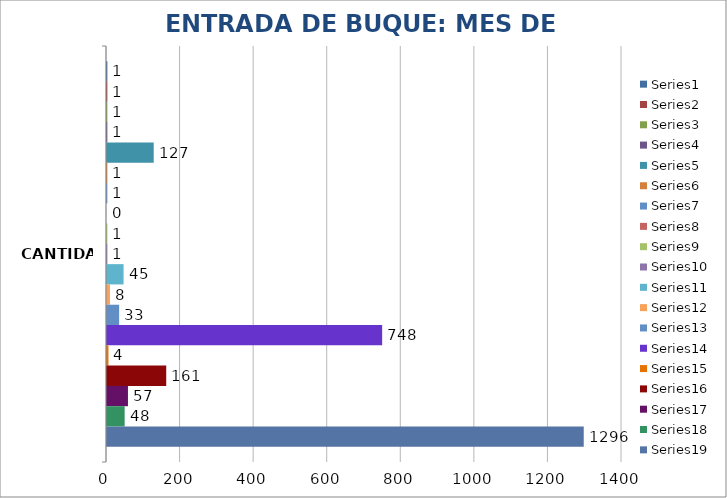
| Category | Series 0 | Series 1 | Series 2 | Series 3 | Series 4 | Series 5 | Series 6 | Series 7 | Series 8 | Series 9 | Series 10 | Series 11 | Series 12 | Series 13 | Series 14 | Series 15 | Series 16 | Series 17 | Series 18 |
|---|---|---|---|---|---|---|---|---|---|---|---|---|---|---|---|---|---|---|---|
| CANTIDAD | 1 | 1 | 1 | 1 | 127 | 1 | 1 | 0 | 1 | 1 | 45 | 8 | 33 | 748 | 4 | 161 | 57 | 48 | 1296 |